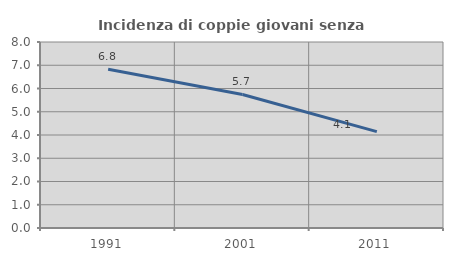
| Category | Incidenza di coppie giovani senza figli |
|---|---|
| 1991.0 | 6.831 |
| 2001.0 | 5.744 |
| 2011.0 | 4.146 |